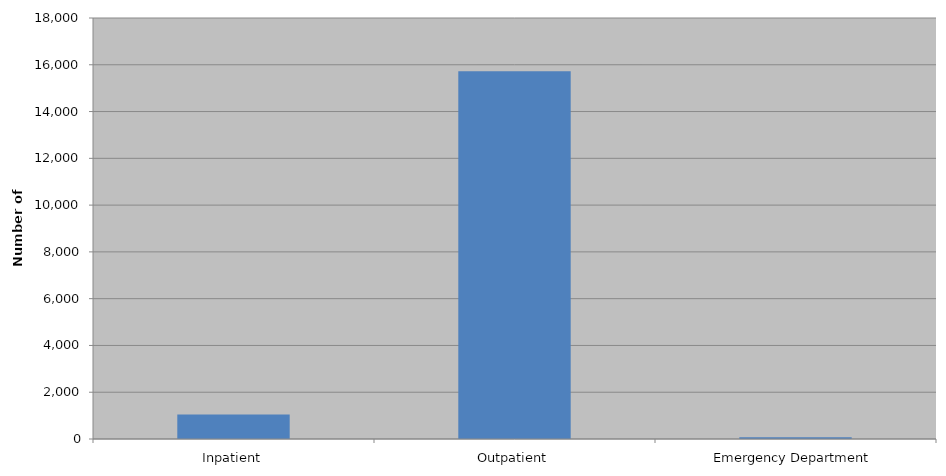
| Category | Total |
|---|---|
| Inpatient | 1051 |
| Outpatient | 15726 |
| Emergency Department | 73 |